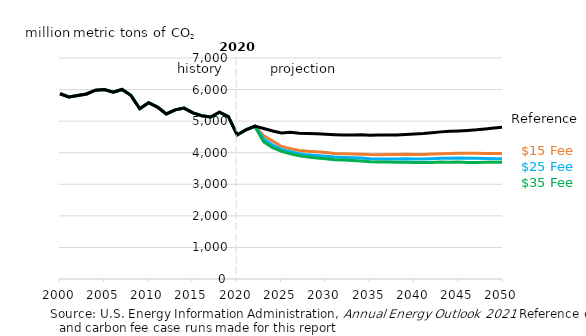
| Category | $15 Fee case | $25 Fee case | $35 Fee case | Reference |
|---|---|---|---|---|
| 2000.0 | 5866.557 | 5866.557 | 5866.557 | 5866.557 |
| 2001.0 | 5764.691 | 5764.691 | 5764.691 | 5764.691 |
| 2002.0 | 5809.24 | 5809.24 | 5809.24 | 5809.24 |
| 2003.0 | 5859.883 | 5859.883 | 5859.883 | 5859.883 |
| 2004.0 | 5978.811 | 5978.811 | 5978.811 | 5978.811 |
| 2005.0 | 5999.151 | 5999.151 | 5999.151 | 5999.151 |
| 2006.0 | 5913.747 | 5913.747 | 5913.747 | 5913.747 |
| 2007.0 | 6003.094 | 6003.094 | 6003.094 | 6003.094 |
| 2008.0 | 5816.568 | 5816.568 | 5816.568 | 5816.568 |
| 2009.0 | 5392.026 | 5392.026 | 5392.026 | 5392.026 |
| 2010.0 | 5584.572 | 5584.572 | 5584.572 | 5584.572 |
| 2011.0 | 5445.886 | 5445.886 | 5445.886 | 5445.886 |
| 2012.0 | 5228.968 | 5228.968 | 5228.968 | 5228.968 |
| 2013.0 | 5356.034 | 5356.034 | 5356.034 | 5356.034 |
| 2014.0 | 5413.237 | 5413.237 | 5413.237 | 5413.237 |
| 2015.0 | 5262.844 | 5262.844 | 5262.844 | 5262.844 |
| 2016.0 | 5170.512 | 5170.512 | 5170.512 | 5170.512 |
| 2017.0 | 5130.583 | 5130.583 | 5130.583 | 5130.583 |
| 2018.0 | 5280.984 | 5280.984 | 5280.984 | 5280.984 |
| 2019.0 | 5141.682 | 5141.682 | 5141.682 | 5141.682 |
| 2020.0 | 4562.533 | 4562.533 | 4562.533 | 4562.533 |
| 2021.0 | 4728.256 | 4728.546 | 4729.019 | 4725.031 |
| 2022.0 | 4834.187 | 4834.011 | 4833.021 | 4844.703 |
| 2023.0 | 4536.333 | 4429.06 | 4340.967 | 4768.64 |
| 2024.0 | 4373.566 | 4245.66 | 4157.909 | 4687.761 |
| 2025.0 | 4194.496 | 4097.324 | 4041.787 | 4622.879 |
| 2026.0 | 4130.5 | 4032.523 | 3969.084 | 4649.904 |
| 2027.0 | 4069.242 | 3970.879 | 3904.748 | 4615.025 |
| 2028.0 | 4045.795 | 3931.79 | 3860.723 | 4606.237 |
| 2029.0 | 4029.491 | 3909.45 | 3830.122 | 4601.101 |
| 2030.0 | 4006.01 | 3890.427 | 3808.329 | 4583.548 |
| 2031.0 | 3978.566 | 3860.826 | 3779.244 | 4570.699 |
| 2032.0 | 3968 | 3847.237 | 3765.756 | 4558.205 |
| 2033.0 | 3960.59 | 3839.456 | 3750.568 | 4558.037 |
| 2034.0 | 3954.164 | 3829.554 | 3735.936 | 4565.222 |
| 2035.0 | 3940.935 | 3810.447 | 3716.303 | 4552.879 |
| 2036.0 | 3936.304 | 3799.532 | 3707.69 | 4559.204 |
| 2037.0 | 3939.81 | 3798.932 | 3705.973 | 4563.648 |
| 2038.0 | 3941.454 | 3799.004 | 3701.125 | 4564.597 |
| 2039.0 | 3948.533 | 3805.401 | 3699.336 | 4578.924 |
| 2040.0 | 3946.346 | 3799.415 | 3693.423 | 4595.75 |
| 2041.0 | 3945.371 | 3798.999 | 3689.525 | 4609.673 |
| 2042.0 | 3955.743 | 3807.947 | 3692.666 | 4635.038 |
| 2043.0 | 3966.653 | 3821.181 | 3702.83 | 4660.16 |
| 2044.0 | 3975.914 | 3825.175 | 3700.657 | 4679.69 |
| 2045.0 | 3982.521 | 3829.786 | 3702.399 | 4691.075 |
| 2046.0 | 3984.108 | 3827.72 | 3691.039 | 4707.084 |
| 2047.0 | 3984.306 | 3823.521 | 3690.88 | 4725.868 |
| 2048.0 | 3977.021 | 3818.02 | 3697.136 | 4753.484 |
| 2049.0 | 3972.568 | 3807.641 | 3697.277 | 4779.4 |
| 2050.0 | 3976.769 | 3805.352 | 3694.97 | 4806.914 |